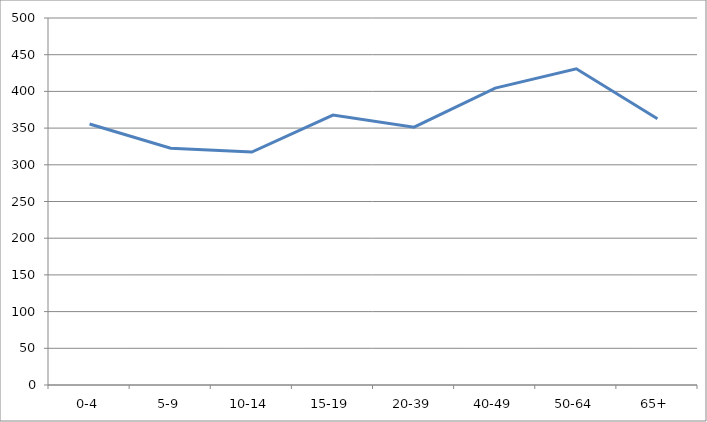
| Category | Series 0 |
|---|---|
| 0-4 | 355.619 |
| 5-9 | 322.598 |
| 10-14 | 317.375 |
| 15-19 | 367.773 |
| 20-39 | 351.246 |
| 40-49 | 404.423 |
| 50-64 | 430.8 |
| 65+ | 362.713 |